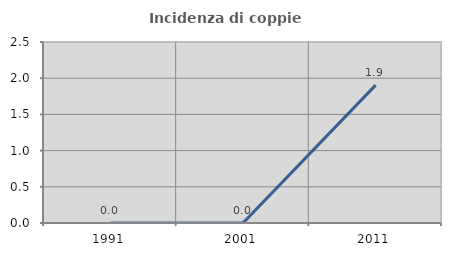
| Category | Incidenza di coppie miste |
|---|---|
| 1991.0 | 0 |
| 2001.0 | 0 |
| 2011.0 | 1.905 |